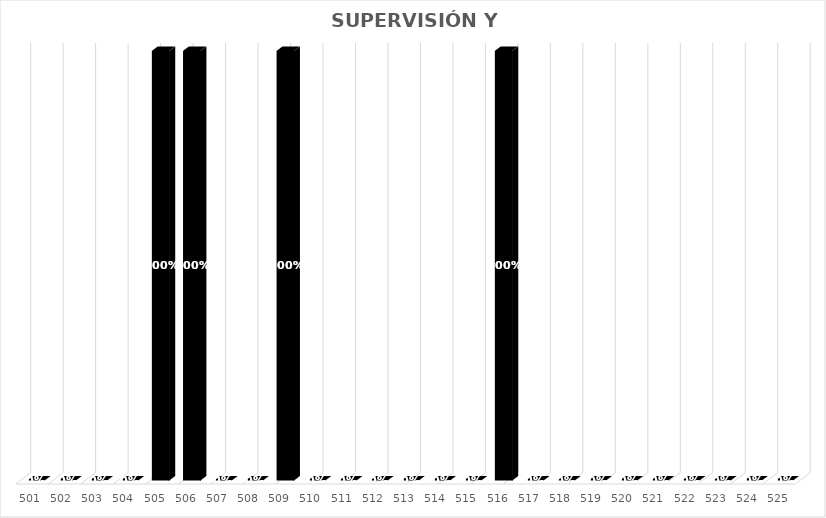
| Category | % Avance |
|---|---|
| 501.0 | 0 |
| 502.0 | 0 |
| 503.0 | 0 |
| 504.0 | 0 |
| 505.0 | 1 |
| 506.0 | 1 |
| 507.0 | 0 |
| 508.0 | 0 |
| 509.0 | 1 |
| 510.0 | 0 |
| 511.0 | 0 |
| 512.0 | 0 |
| 513.0 | 0 |
| 514.0 | 0 |
| 515.0 | 0 |
| 516.0 | 1 |
| 517.0 | 0 |
| 518.0 | 0 |
| 519.0 | 0 |
| 520.0 | 0 |
| 521.0 | 0 |
| 522.0 | 0 |
| 523.0 | 0 |
| 524.0 | 0 |
| 525.0 | 0 |